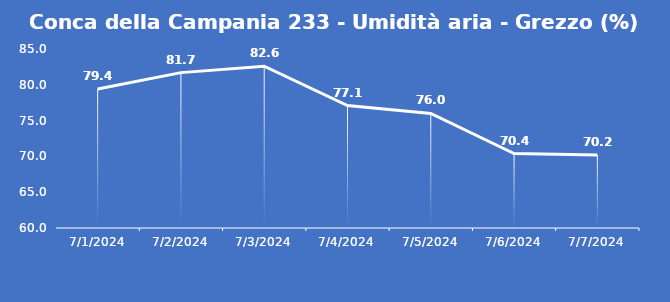
| Category | Conca della Campania 233 - Umidità aria - Grezzo (%) |
|---|---|
| 7/1/24 | 79.4 |
| 7/2/24 | 81.7 |
| 7/3/24 | 82.6 |
| 7/4/24 | 77.1 |
| 7/5/24 | 76 |
| 7/6/24 | 70.4 |
| 7/7/24 | 70.2 |